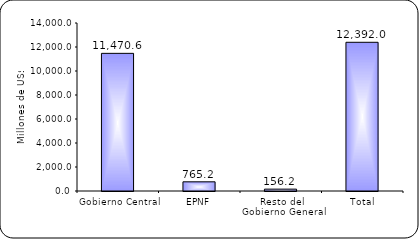
| Category | Series 1 |
|---|---|
| Gobierno Central | 11470.6 |
| EPNF | 765.2 |
| Resto del Gobierno General | 156.2 |
| Total | 12392 |